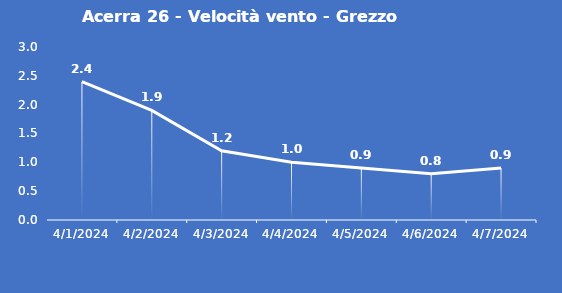
| Category | Acerra 26 - Velocità vento - Grezzo (m/s) |
|---|---|
| 4/1/24 | 2.4 |
| 4/2/24 | 1.9 |
| 4/3/24 | 1.2 |
| 4/4/24 | 1 |
| 4/5/24 | 0.9 |
| 4/6/24 | 0.8 |
| 4/7/24 | 0.9 |